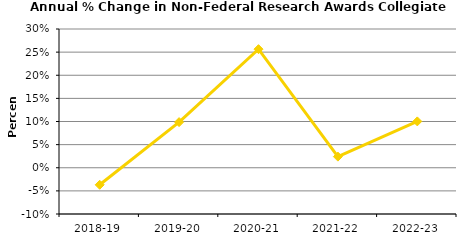
| Category | Collegiate Units |
|---|---|
| 2018-19 | -0.037 |
| 2019-20 | 0.099 |
| 2020-21 | 0.256 |
| 2021-22 | 0.024 |
| 2022-23 | 0.1 |